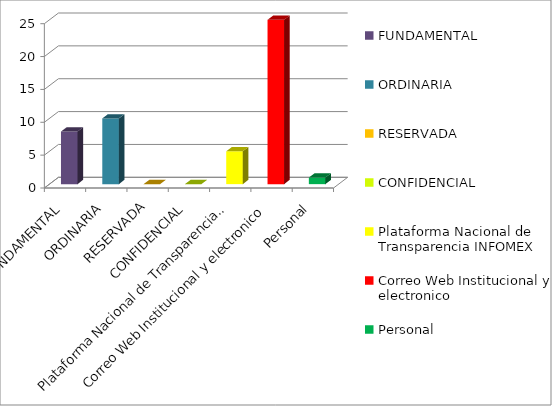
| Category | Series 2 |
|---|---|
| FUNDAMENTAL | 8 |
| ORDINARIA | 10 |
| RESERVADA | 0 |
| CONFIDENCIAL | 0 |
| Plataforma Nacional de Transparencia INFOMEX | 5 |
| Correo Web Institucional y electronico | 25 |
| Personal | 1 |